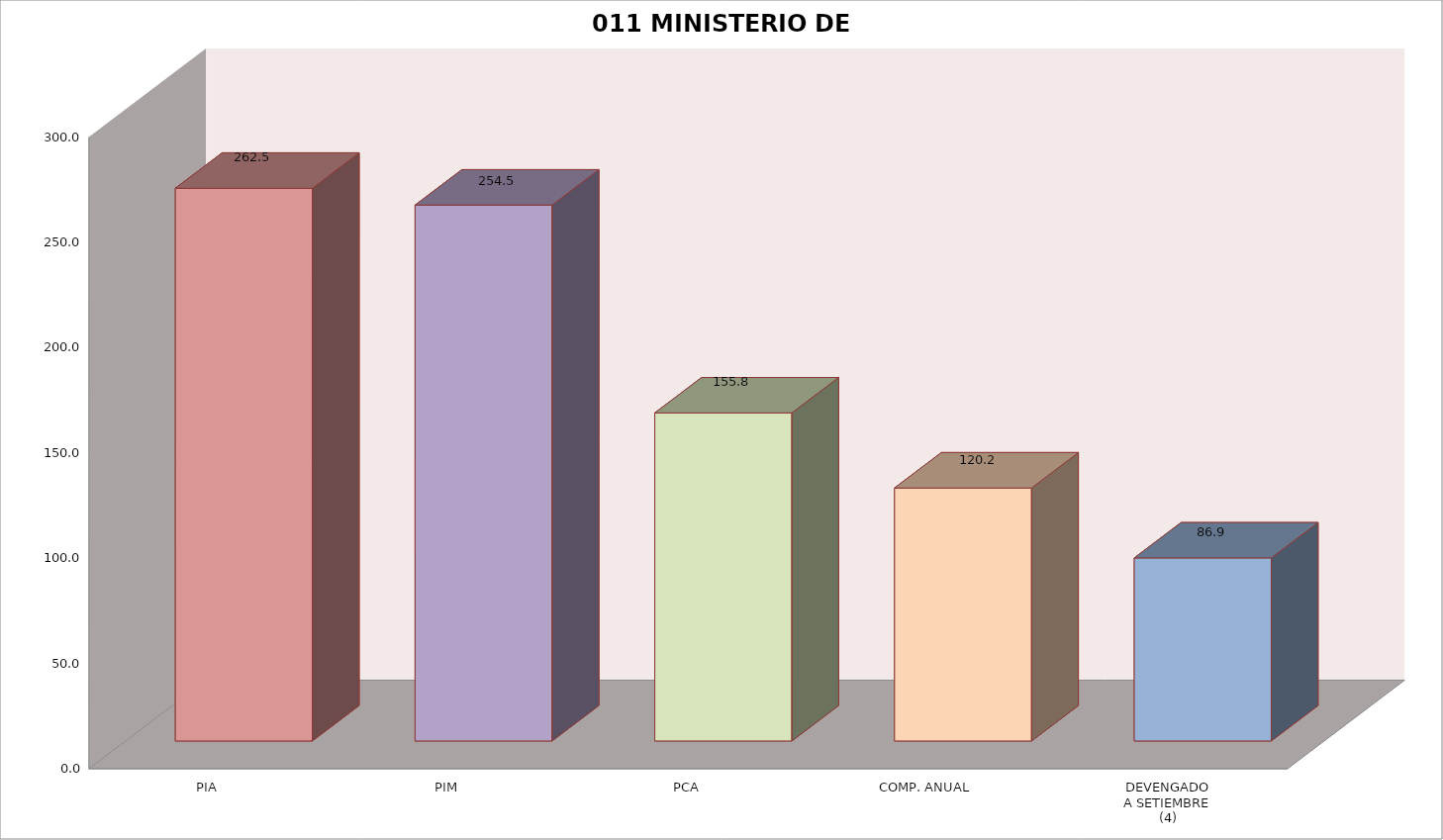
| Category | 011 MINISTERIO DE SALUD |
|---|---|
| PIA | 262.508 |
| PIM | 254.515 |
| PCA | 155.81 |
| COMP. ANUAL | 120.154 |
| DEVENGADO
A SETIEMBRE
(4) | 86.927 |